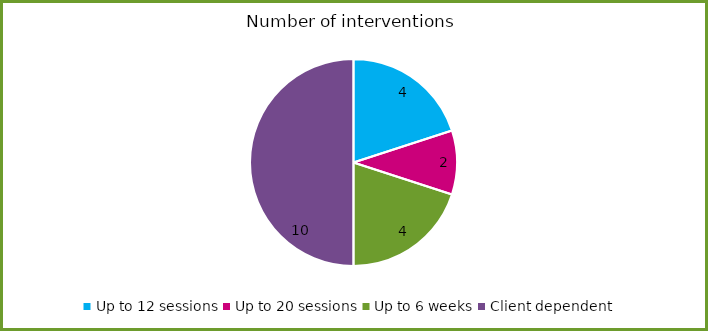
| Category | Series 0 |
|---|---|
| Up to 12 sessions | 4 |
| Up to 20 sessions | 2 |
| Up to 6 weeks | 4 |
| Client dependent | 10 |